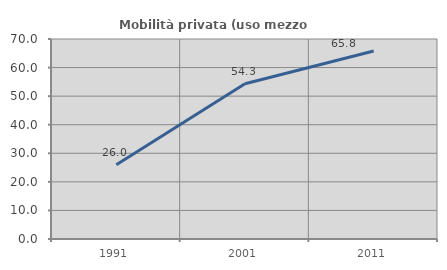
| Category | Mobilità privata (uso mezzo privato) |
|---|---|
| 1991.0 | 25.966 |
| 2001.0 | 54.321 |
| 2011.0 | 65.827 |